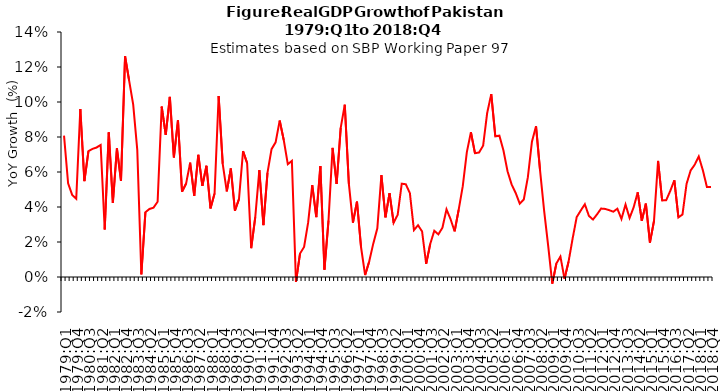
| Category | Series 0 |
|---|---|
| 1979:Q1 | 0.081 |
| 1979:Q2 | 0.054 |
| 1979:Q3 | 0.047 |
| 1979:Q4 | 0.045 |
| 1980:Q1 | 0.096 |
| 1980:Q2 | 0.055 |
| 1980:Q3 | 0.072 |
| 1980:Q4 | 0.073 |
| 1981:Q1 | 0.074 |
| 1981:Q2 | 0.075 |
| 1981:Q3 | 0.027 |
| 1981:Q4 | 0.083 |
| 1982:Q1 | 0.042 |
| 1982:Q2 | 0.074 |
| 1982:Q3 | 0.055 |
| 1982:Q4 | 0.126 |
| 1983:Q1 | 0.112 |
| 1983:Q2 | 0.098 |
| 1983:Q3 | 0.073 |
| 1983:Q4 | 0.002 |
| 1984:Q1 | 0.037 |
| 1984:Q2 | 0.039 |
| 1984:Q3 | 0.04 |
| 1984:Q4 | 0.043 |
| 1985:Q1 | 0.097 |
| 1985:Q2 | 0.081 |
| 1985:Q3 | 0.103 |
| 1985:Q4 | 0.068 |
| 1986:Q1 | 0.09 |
| 1986:Q2 | 0.049 |
| 1986:Q3 | 0.053 |
| 1986:Q4 | 0.065 |
| 1987:Q1 | 0.046 |
| 1987:Q2 | 0.07 |
| 1987:Q3 | 0.052 |
| 1987:Q4 | 0.064 |
| 1988:Q1 | 0.039 |
| 1988:Q2 | 0.048 |
| 1988:Q3 | 0.103 |
| 1988:Q4 | 0.065 |
| 1989:Q1 | 0.049 |
| 1989:Q2 | 0.062 |
| 1989:Q3 | 0.038 |
| 1989:Q4 | 0.045 |
| 1990:Q1 | 0.072 |
| 1990:Q2 | 0.065 |
| 1990:Q3 | 0.016 |
| 1990:Q4 | 0.034 |
| 1991:Q1 | 0.061 |
| 1991:Q2 | 0.03 |
| 1991:Q3 | 0.06 |
| 1991:Q4 | 0.073 |
| 1992:Q1 | 0.077 |
| 1992:Q2 | 0.089 |
| 1992:Q3 | 0.078 |
| 1992:Q4 | 0.064 |
| 1993:Q1 | 0.066 |
| 1993:Q2 | -0.003 |
| 1993:Q3 | 0.013 |
| 1993:Q4 | 0.017 |
| 1994:Q1 | 0.031 |
| 1994:Q2 | 0.052 |
| 1994:Q3 | 0.034 |
| 1994:Q4 | 0.063 |
| 1995:Q1 | 0.004 |
| 1995:Q2 | 0.032 |
| 1995:Q3 | 0.074 |
| 1995:Q4 | 0.053 |
| 1996:Q1 | 0.085 |
| 1996:Q2 | 0.098 |
| 1996:Q3 | 0.053 |
| 1996:Q4 | 0.031 |
| 1997:Q1 | 0.043 |
| 1997:Q2 | 0.017 |
| 1997:Q3 | 0.001 |
| 1997:Q4 | 0.009 |
| 1998:Q1 | 0.019 |
| 1998:Q2 | 0.028 |
| 1998:Q3 | 0.058 |
| 1998:Q4 | 0.034 |
| 1999:Q1 | 0.048 |
| 1999:Q2 | 0.031 |
| 1999:Q3 | 0.036 |
| 1999:Q4 | 0.053 |
| 2000:Q1 | 0.053 |
| 2000:Q2 | 0.048 |
| 2000:Q3 | 0.027 |
| 2000:Q4 | 0.03 |
| 2001:Q1 | 0.026 |
| 2001:Q2 | 0.007 |
| 2001:Q3 | 0.019 |
| 2001:Q4 | 0.026 |
| 2002:Q1 | 0.024 |
| 2002:Q2 | 0.028 |
| 2002:Q3 | 0.039 |
| 2002:Q4 | 0.033 |
| 2003:Q1 | 0.026 |
| 2003:Q2 | 0.039 |
| 2003:Q3 | 0.052 |
| 2003:Q4 | 0.071 |
| 2004:Q1 | 0.083 |
| 2004:Q2 | 0.071 |
| 2004:Q3 | 0.071 |
| 2004:Q4 | 0.075 |
| 2005:Q1 | 0.094 |
| 2005:Q2 | 0.104 |
| 2005:Q3 | 0.08 |
| 2005:Q4 | 0.081 |
| 2006:Q1 | 0.072 |
| 2006:Q2 | 0.06 |
| 2006:Q3 | 0.053 |
| 2006:Q4 | 0.048 |
| 2007:Q1 | 0.042 |
| 2007:Q2 | 0.044 |
| 2007:Q3 | 0.057 |
| 2007:Q4 | 0.077 |
| 2008:Q1 | 0.086 |
| 2008:Q2 | 0.061 |
| 2008:Q3 | 0.038 |
| 2008:Q4 | 0.018 |
| 2009:Q1 | -0.004 |
| 2009:Q2 | 0.008 |
| 2009:Q3 | 0.012 |
| 2009:Q4 | -0.001 |
| 2010:Q1 | 0.009 |
| 2010:Q2 | 0.022 |
| 2010:Q3 | 0.034 |
| 2010:Q4 | 0.038 |
| 2011:Q1 | 0.042 |
| 2011:Q2 | 0.035 |
| 2011:Q3 | 0.033 |
| 2011:Q4 | 0.036 |
| 2012:Q1 | 0.039 |
| 2012:Q2 | 0.039 |
| 2012:Q3 | 0.038 |
| 2012:Q4 | 0.037 |
| 2013:Q1 | 0.039 |
| 2013:Q2 | 0.033 |
| 2013:Q3 | 0.041 |
| 2013:Q4 | 0.034 |
| 2014:Q1 | 0.04 |
| 2014:Q2 | 0.048 |
| 2014:Q3 | 0.032 |
| 2014:Q4 | 0.042 |
| 2015:Q1 | 0.02 |
| 2015:Q2 | 0.032 |
| 2015:Q3 | 0.066 |
| 2015:Q4 | 0.044 |
| 2016:Q1 | 0.044 |
| 2016:Q2 | 0.049 |
| 2016:Q3 | 0.055 |
| 2016:Q4 | 0.034 |
| 2017:Q1 | 0.036 |
| 2017:Q2 | 0.053 |
| 2017:Q3 | 0.061 |
| 2017:Q4 | 0.064 |
| 2018:Q1 | 0.069 |
| 2018:Q2 | 0.061 |
| 2018:Q3 | 0.051 |
| 2018:Q4 | 0.051 |